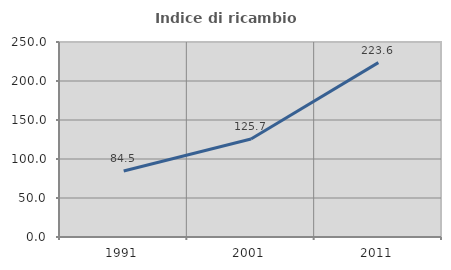
| Category | Indice di ricambio occupazionale  |
|---|---|
| 1991.0 | 84.524 |
| 2001.0 | 125.668 |
| 2011.0 | 223.602 |